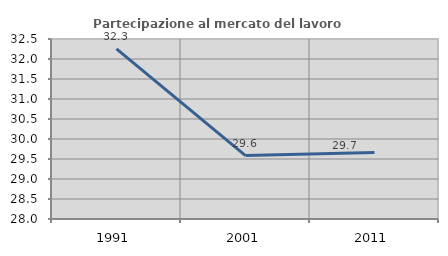
| Category | Partecipazione al mercato del lavoro  femminile |
|---|---|
| 1991.0 | 32.255 |
| 2001.0 | 29.585 |
| 2011.0 | 29.664 |